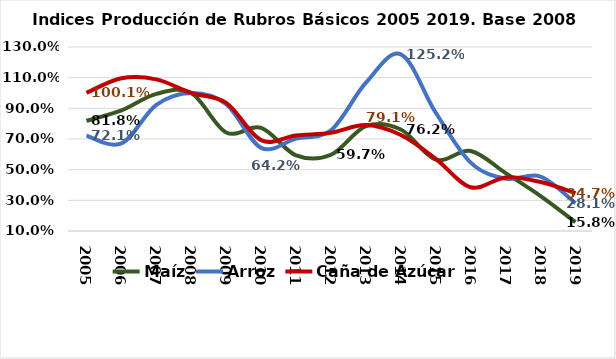
| Category | Maíz | Arroz | Caña de Azúcar |
|---|---|---|---|
| 2005.0 | 0.818 | 0.721 | 1.001 |
| 2006.0 | 0.886 | 0.671 | 1.096 |
| 2007.0 | 0.994 | 0.922 | 1.089 |
| 2008.0 | 1 | 1 | 1 |
| 2009.0 | 0.743 | 0.928 | 0.935 |
| 2010.0 | 0.773 | 0.642 | 0.692 |
| 2011.0 | 0.593 | 0.702 | 0.723 |
| 2012.0 | 0.597 | 0.757 | 0.741 |
| 2013.0 | 0.784 | 1.067 | 0.791 |
| 2014.0 | 0.762 | 1.252 | 0.726 |
| 2015.0 | 0.566 | 0.871 | 0.571 |
| 2016.0 | 0.622 | 0.546 | 0.386 |
| 2017.0 | 0.477 | 0.441 | 0.449 |
| 2018.0 | 0.328 | 0.455 | 0.419 |
| 2019.0 | 0.158 | 0.281 | 0.347 |